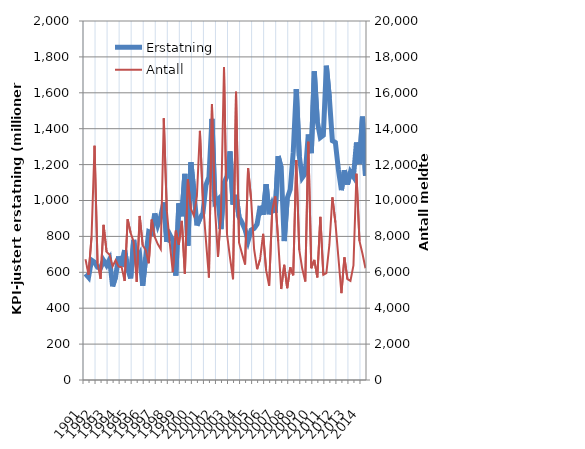
| Category | Erstatning |
|---|---|
| 1991.0 | 591.579 |
| nan | 572.287 |
| nan | 667.746 |
| nan | 656.396 |
| 1992.0 | 628.056 |
| nan | 624.045 |
| nan | 666.31 |
| nan | 639.591 |
| 1993.0 | 671.598 |
| nan | 521.577 |
| nan | 575.46 |
| nan | 688.697 |
| 1994.0 | 630.593 |
| nan | 723.392 |
| nan | 620.001 |
| nan | 566.075 |
| 1995.0 | 780.199 |
| nan | 659.448 |
| nan | 695.815 |
| nan | 524.742 |
| 1996.0 | 683.679 |
| nan | 825.944 |
| nan | 817.707 |
| nan | 927.833 |
| 1997.0 | 862.99 |
| nan | 912.615 |
| nan | 989.399 |
| nan | 769.195 |
| 1998.0 | 810.336 |
| nan | 776.529 |
| nan | 581.982 |
| nan | 984.311 |
| 1999.0 | 912.004 |
| nan | 1148.447 |
| nan | 748.195 |
| nan | 1212.986 |
| 2000.0 | 1051.918 |
| nan | 860.872 |
| nan | 900.019 |
| nan | 928.845 |
| 2001.0 | 1085.732 |
| nan | 1130.17 |
| nan | 1455.22 |
| nan | 991.747 |
| 2002.0 | 1007.298 |
| nan | 840.702 |
| nan | 1096.987 |
| nan | 1134.655 |
| 2003.0 | 1273.143 |
| nan | 977.282 |
| nan | 1031.625 |
| nan | 908.532 |
| 2004.0 | 876.233 |
| nan | 838.217 |
| nan | 775.153 |
| nan | 835.101 |
| 2005.0 | 844.15 |
| nan | 868.456 |
| nan | 970.181 |
| nan | 920.658 |
| 2006.0 | 1090.174 |
| nan | 923.351 |
| nan | 979.214 |
| nan | 931.506 |
| 2007.0 | 1247.432 |
| nan | 1181.709 |
| nan | 774.213 |
| nan | 1012.832 |
| 2008.0 | 1060.83 |
| nan | 1269.18 |
| nan | 1620.539 |
| nan | 1248.372 |
| 2009.0 | 1127.173 |
| nan | 1150.789 |
| nan | 1367.791 |
| nan | 1263.77 |
| 2010.0 | 1718.949 |
| nan | 1438.512 |
| nan | 1350.611 |
| nan | 1363.638 |
| 2011.0 | 1750.887 |
| nan | 1570.857 |
| nan | 1333.081 |
| nan | 1323.348 |
| 2012.0 | 1172.15 |
| nan | 1057.497 |
| nan | 1168.635 |
| nan | 1088.862 |
| 2013.0 | 1158.544 |
| nan | 1132.862 |
| nan | 1323.389 |
| nan | 1202.804 |
| 2014.0 | 1467.42 |
| nan | 1137.576 |